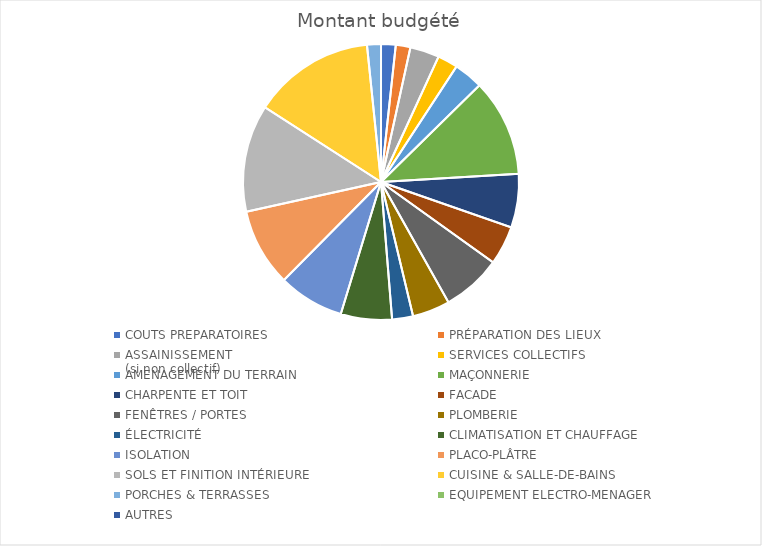
| Category |  Montant budgété  |
|---|---|
| COUTS PREPARATOIRES | 3000 |
| PRÉPARATION DES LIEUX | 3000 |
| ASSAINISSEMENT 
(si non collectif) | 6000 |
| SERVICES COLLECTIFS | 4150 |
| AMENAGEMENT DU TERRAIN | 6000 |
| MAÇONNERIE | 20000 |
| CHARPENTE ET TOIT | 11000 |
| FACADE | 8000 |
| FENÊTRES / PORTES | 12200 |
| PLOMBERIE | 7700 |
| ÉLECTRICITÉ | 4300 |
| CLIMATISATION ET CHAUFFAGE | 10500 |
| ISOLATION | 13500 |
| PLACO-PLÂTRE | 16000 |
| SOLS ET FINITION INTÉRIEURE | 22000 |
| CUISINE & SALLE-DE-BAINS | 25000 |
| PORCHES & TERRASSES | 2850 |
| EQUIPEMENT ELECTRO-MENAGER | 0 |
| AUTRES | 0 |